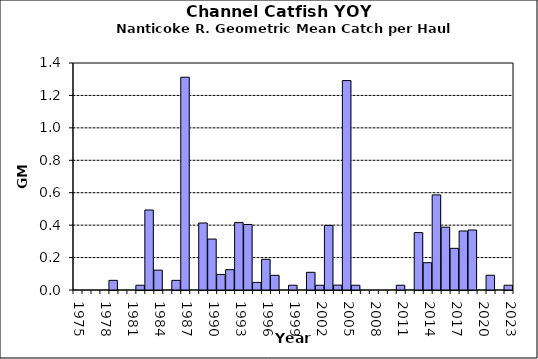
| Category | Series 0 |
|---|---|
| 1975.0 | 0 |
| 1976.0 | 0 |
| 1977.0 | 0 |
| 1978.0 | 0 |
| 1979.0 | 0.059 |
| 1980.0 | 0 |
| 1981.0 | 0 |
| 1982.0 | 0.029 |
| 1983.0 | 0.493 |
| 1984.0 | 0.122 |
| 1985.0 | 0 |
| 1986.0 | 0.059 |
| 1987.0 | 1.312 |
| 1988.0 | 0 |
| 1989.0 | 0.413 |
| 1990.0 | 0.314 |
| 1991.0 | 0.096 |
| 1992.0 | 0.125 |
| 1993.0 | 0.416 |
| 1994.0 | 0.404 |
| 1995.0 | 0.047 |
| 1996.0 | 0.189 |
| 1997.0 | 0.091 |
| 1998.0 | 0 |
| 1999.0 | 0.029 |
| 2000.0 | 0 |
| 2001.0 | 0.109 |
| 2002.0 | 0.029 |
| 2003.0 | 0.398 |
| 2004.0 | 0.03 |
| 2005.0 | 1.292 |
| 2006.0 | 0.029 |
| 2007.0 | 0 |
| 2008.0 | 0 |
| 2009.0 | 0 |
| 2010.0 | 0 |
| 2011.0 | 0.029 |
| 2012.0 | 0 |
| 2013.0 | 0.354 |
| 2014.0 | 0.169 |
| 2015.0 | 0.587 |
| 2016.0 | 0.388 |
| 2017.0 | 0.257 |
| 2018.0 | 0.364 |
| 2019.0 | 0.37 |
| 2020.0 | 0 |
| 2021.0 | 0.091 |
| 2022.0 | 0 |
| 2023.0 | 0.029 |